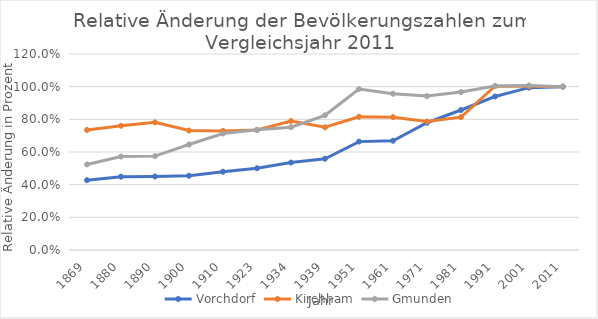
| Category | Vorchdorf | Kirchham | Gmunden |
|---|---|---|---|
| 1869.0 | 0.427 | 0.735 | 0.524 |
| 1880.0 | 0.449 | 0.76 | 0.572 |
| 1890.0 | 0.45 | 0.781 | 0.575 |
| 1900.0 | 0.455 | 0.732 | 0.646 |
| 1910.0 | 0.479 | 0.729 | 0.713 |
| 1923.0 | 0.501 | 0.734 | 0.736 |
| 1934.0 | 0.536 | 0.789 | 0.752 |
| 1939.0 | 0.559 | 0.752 | 0.825 |
| 1951.0 | 0.664 | 0.816 | 0.985 |
| 1961.0 | 0.669 | 0.813 | 0.957 |
| 1971.0 | 0.779 | 0.787 | 0.942 |
| 1981.0 | 0.857 | 0.813 | 0.967 |
| 1991.0 | 0.94 | 1.003 | 1.004 |
| 2001.0 | 0.994 | 1.003 | 1.007 |
| 2011.0 | 1 | 1 | 1 |